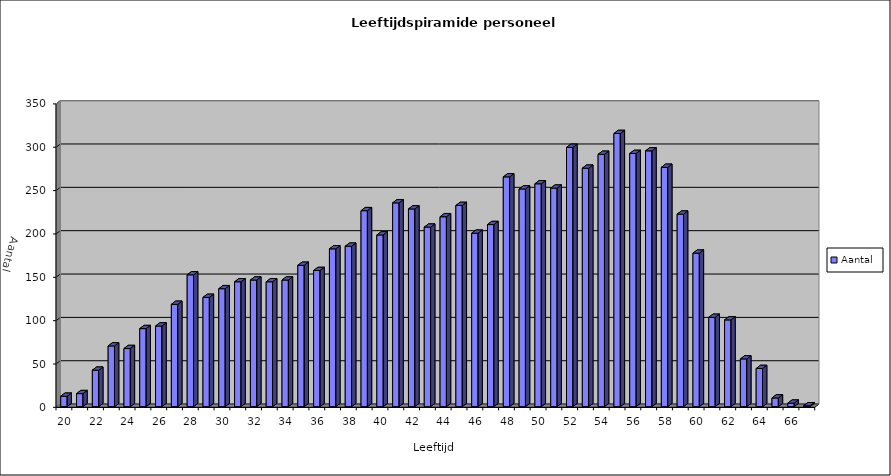
| Category | Aantal |
|---|---|
| 20.0 | 12 |
| 21.0 | 15 |
| 22.0 | 42 |
| 23.0 | 70 |
| 24.0 | 67 |
| 25.0 | 90 |
| 26.0 | 93 |
| 27.0 | 118 |
| 28.0 | 152 |
| 29.0 | 126 |
| 30.0 | 136 |
| 31.0 | 144 |
| 32.0 | 146 |
| 33.0 | 144 |
| 34.0 | 146 |
| 35.0 | 163 |
| 36.0 | 157 |
| 37.0 | 182 |
| 38.0 | 185 |
| 39.0 | 226 |
| 40.0 | 198 |
| 41.0 | 235 |
| 42.0 | 228 |
| 43.0 | 207 |
| 44.0 | 219 |
| 45.0 | 232 |
| 46.0 | 200 |
| 47.0 | 210 |
| 48.0 | 265 |
| 49.0 | 251 |
| 50.0 | 257 |
| 51.0 | 252 |
| 52.0 | 299 |
| 53.0 | 275 |
| 54.0 | 291 |
| 55.0 | 315 |
| 56.0 | 292 |
| 57.0 | 295 |
| 58.0 | 276 |
| 59.0 | 222 |
| 60.0 | 177 |
| 61.0 | 103 |
| 62.0 | 100 |
| 63.0 | 55 |
| 64.0 | 44 |
| 65.0 | 10 |
| 66.0 | 4 |
| 67.0 | 1 |